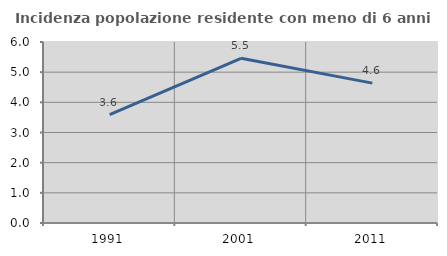
| Category | Incidenza popolazione residente con meno di 6 anni |
|---|---|
| 1991.0 | 3.59 |
| 2001.0 | 5.459 |
| 2011.0 | 4.637 |